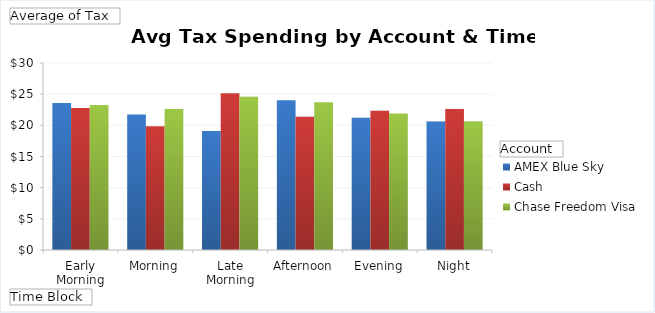
| Category | AMEX Blue Sky | Cash | Chase Freedom Visa |
|---|---|---|---|
| Early Morning | 23.568 | 22.766 | 23.249 |
| Morning | 21.749 | 19.869 | 22.624 |
| Late Morning | 19.092 | 25.147 | 24.574 |
| Afternoon | 24.01 | 21.372 | 23.719 |
| Evening | 21.216 | 22.334 | 21.918 |
| Night | 20.597 | 22.637 | 20.672 |